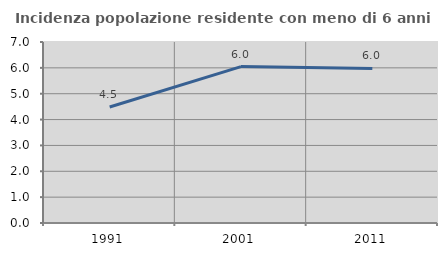
| Category | Incidenza popolazione residente con meno di 6 anni |
|---|---|
| 1991.0 | 4.488 |
| 2001.0 | 6.048 |
| 2011.0 | 5.977 |